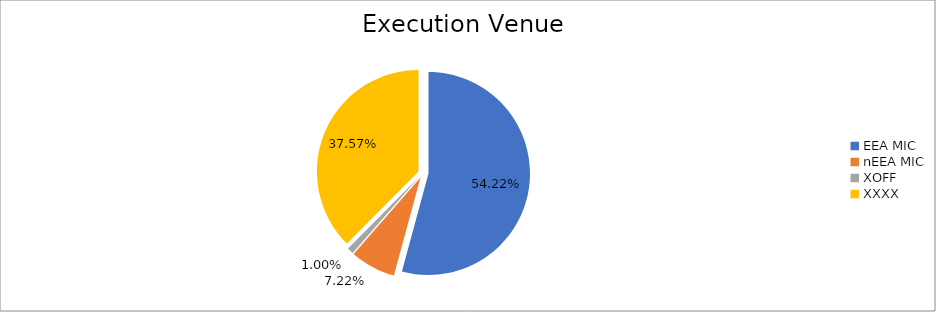
| Category | Series 0 |
|---|---|
| EEA MIC | 6809160.837 |
| nEEA MIC | 906744.304 |
| XOFF | 125035.929 |
| XXXX | 4718036.537 |